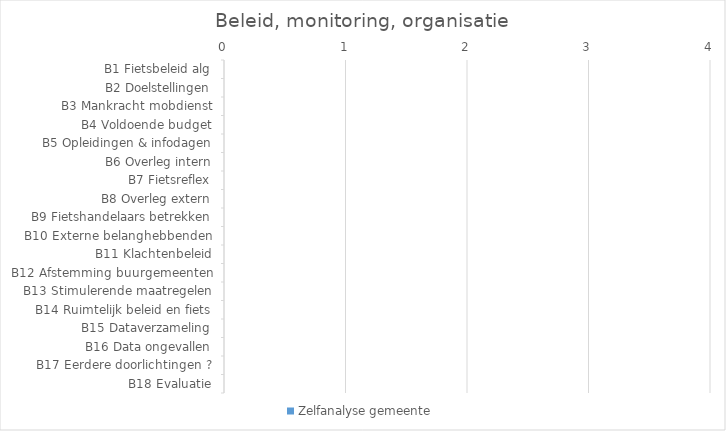
| Category | Zelfanalyse gemeente |
|---|---|
| B1 Fietsbeleid alg | 0 |
| B2 Doelstellingen | 0 |
| B3 Mankracht mobdienst | 0 |
| B4 Voldoende budget | 0 |
| B5 Opleidingen & infodagen | 0 |
| B6 Overleg intern | 0 |
| B7 Fietsreflex | 0 |
| B8 Overleg extern | 0 |
| B9 Fietshandelaars betrekken | 0 |
| B10 Externe belanghebbenden | 0 |
| B11 Klachtenbeleid | 0 |
| B12 Afstemming buurgemeenten | 0 |
| B13 Stimulerende maatregelen | 0 |
| B14 Ruimtelijk beleid en fiets | 0 |
| B15 Dataverzameling | 0 |
| B16 Data ongevallen | 0 |
| B17 Eerdere doorlichtingen ? | 0 |
| B18 Evaluatie | 0 |